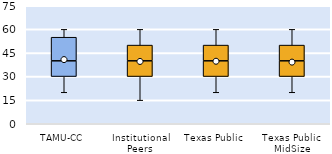
| Category | 25th | 50th | 75th |
|---|---|---|---|
| TAMU-CC | 30 | 10 | 15 |
| Institutional Peers | 30 | 10 | 10 |
| Texas Public | 30 | 10 | 10 |
| Texas Public MidSize | 30 | 10 | 10 |